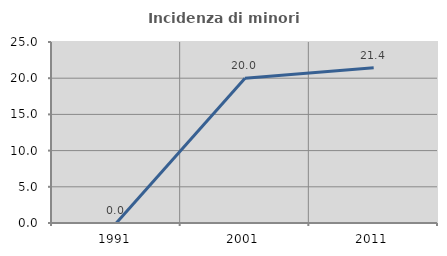
| Category | Incidenza di minori stranieri |
|---|---|
| 1991.0 | 0 |
| 2001.0 | 20 |
| 2011.0 | 21.429 |